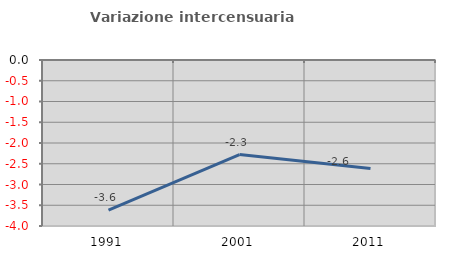
| Category | Variazione intercensuaria annua |
|---|---|
| 1991.0 | -3.617 |
| 2001.0 | -2.279 |
| 2011.0 | -2.615 |